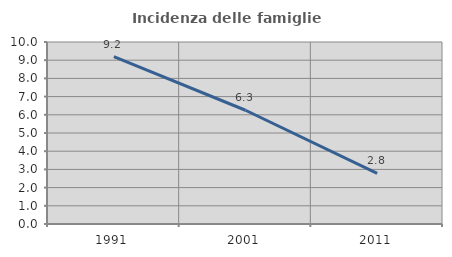
| Category | Incidenza delle famiglie numerose |
|---|---|
| 1991.0 | 9.195 |
| 2001.0 | 6.25 |
| 2011.0 | 2.778 |